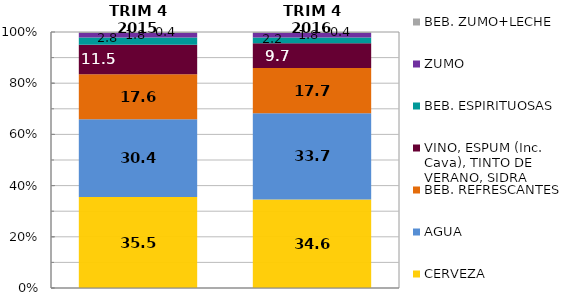
| Category | CERVEZA | AGUA | BEB. REFRESCANTES | VINO, ESPUM (Inc. Cava), TINTO DE VERANO, SIDRA | BEB. ESPIRITUOSAS | ZUMO | BEB. ZUMO+LECHE |
|---|---|---|---|---|---|---|---|
| TRIM 4 2015 | 35.542 | 30.365 | 17.596 | 11.55 | 2.827 | 1.752 | 0.367 |
| TRIM 4 2016 | 34.575 | 33.733 | 17.676 | 9.661 | 2.206 | 1.787 | 0.363 |